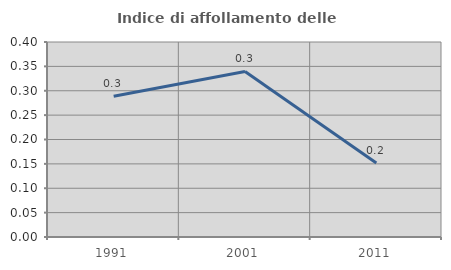
| Category | Indice di affollamento delle abitazioni  |
|---|---|
| 1991.0 | 0.289 |
| 2001.0 | 0.34 |
| 2011.0 | 0.152 |